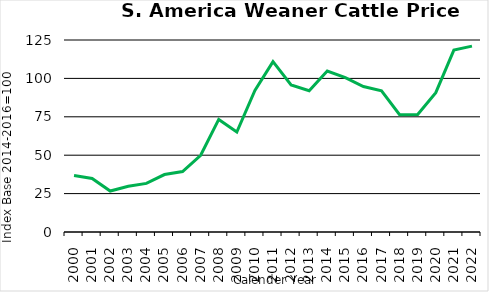
| Category | AR, BR, UY |
|---|---|
| 2000.0 | 36.748 |
| 2001.0 | 34.828 |
| 2002.0 | 26.687 |
| 2003.0 | 29.748 |
| 2004.0 | 31.66 |
| 2005.0 | 37.402 |
| 2006.0 | 39.375 |
| 2007.0 | 49.969 |
| 2008.0 | 73.306 |
| 2009.0 | 65.082 |
| 2010.0 | 92.212 |
| 2011.0 | 110.95 |
| 2012.0 | 95.772 |
| 2013.0 | 91.931 |
| 2014.0 | 104.752 |
| 2015.0 | 100.56 |
| 2016.0 | 94.688 |
| 2017.0 | 91.869 |
| 2018.0 | 76.385 |
| 2019.0 | 76.458 |
| 2020.0 | 90.698 |
| 2021.0 | 118.421 |
| 2022.0 | 120.993 |